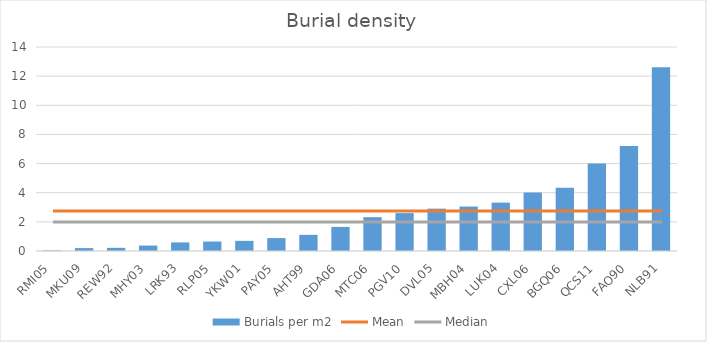
| Category | Burials per m2 |
|---|---|
| RMI05 | 0.036 |
| MKU09 | 0.199 |
| REW92 | 0.217 |
| MHY03 | 0.373 |
| LRK93 | 0.59 |
| RLP05 | 0.65 |
| YKW01 | 0.696 |
| PAY05 | 0.886 |
| AHT99 | 1.109 |
| GDA06 | 1.653 |
| MTC06 | 2.32 |
| PGV10 | 2.6 |
| DVL05 | 2.905 |
| MBH04 | 3.051 |
| LUK04 | 3.32 |
| CXL06 | 4.019 |
| BGQ06 | 4.347 |
| QCS11 | 6 |
| FAO90 | 7.214 |
| NLB91 | 12.611 |